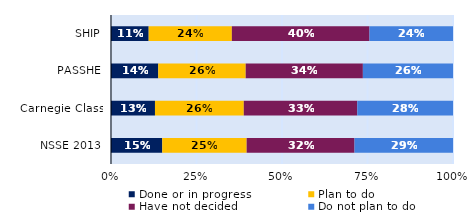
| Category | Done or in progress | Plan to do | Have not decided | Do not plan to do |
|---|---|---|---|---|
| SHIP | 0.11 | 0.243 | 0.402 | 0.244 |
| PASSHE | 0.138 | 0.256 | 0.343 | 0.264 |
| Carnegie Class | 0.129 | 0.26 | 0.332 | 0.28 |
| NSSE 2013 | 0.15 | 0.247 | 0.315 | 0.288 |